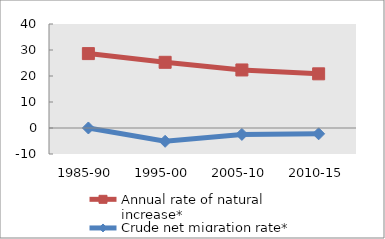
| Category | Annual rate of natural increase* | Crude net migration rate* |
|---|---|---|
| 1985-90 | 28.612 | 0.007 |
| 1995-00 | 25.266 | -5.117 |
| 2005-10 | 22.322 | -2.462 |
| 2010-15 | 20.84 | -2.236 |